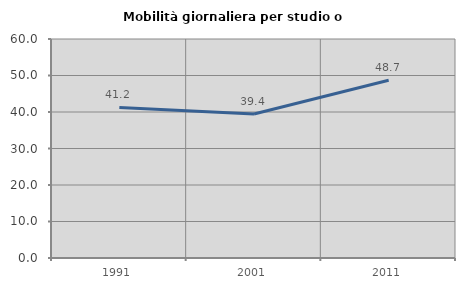
| Category | Mobilità giornaliera per studio o lavoro |
|---|---|
| 1991.0 | 41.246 |
| 2001.0 | 39.444 |
| 2011.0 | 48.68 |